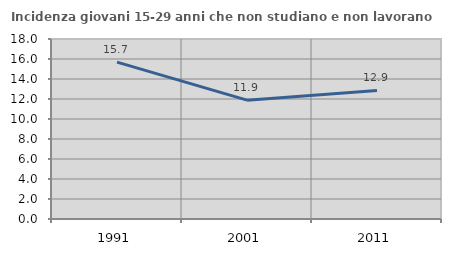
| Category | Incidenza giovani 15-29 anni che non studiano e non lavorano  |
|---|---|
| 1991.0 | 15.69 |
| 2001.0 | 11.882 |
| 2011.0 | 12.857 |